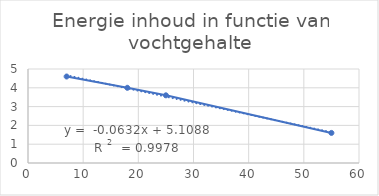
| Category | Series 0 |
|---|---|
| 7.0 | 4.6 |
| 18.0 | 4 |
| 25.0 | 3.6 |
| 55.0 | 1.6 |